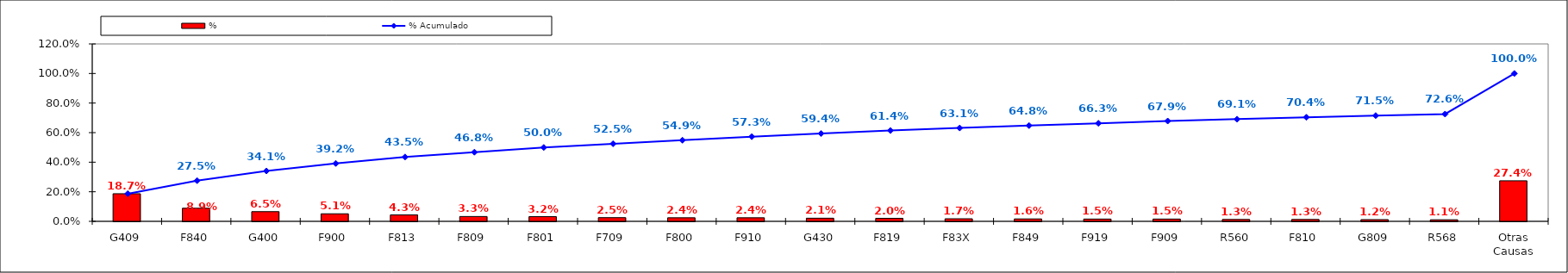
| Category | % |
|---|---|
| G409 | 0.187 |
| F840 | 0.089 |
| G400 | 0.065 |
| F900 | 0.051 |
| F813 | 0.043 |
| F809 | 0.033 |
| F801 | 0.032 |
| F709 | 0.025 |
| F800 | 0.024 |
| F910 | 0.024 |
| G430 | 0.021 |
| F819 | 0.02 |
| F83X | 0.017 |
| F849 | 0.016 |
| F919 | 0.015 |
| F909 | 0.015 |
| R560 | 0.013 |
| F810 | 0.013 |
| G809 | 0.012 |
| R568 | 0.011 |
| Otras Causas | 0.274 |